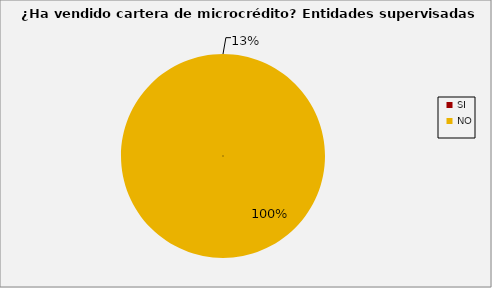
| Category | Series 0 |
|---|---|
| SI | 0 |
| NO | 1 |